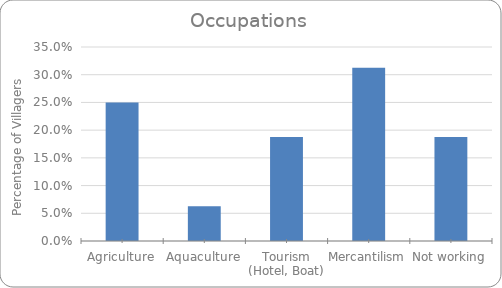
| Category | % |
|---|---|
| Agriculture | 0.25 |
| Aquaculture | 0.062 |
| Tourism (Hotel, Boat) | 0.188 |
| Mercantilism | 0.312 |
| Not working | 0.188 |